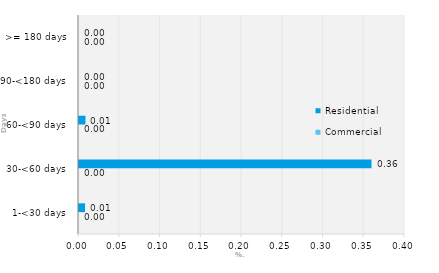
| Category | Commercial | Residential |
|---|---|---|
| 1-<30 days | 0 | 0.007 |
| 30-<60 days | 0 | 0.359 |
| 60-<90 days | 0 | 0.008 |
| 90-<180 days | 0 | 0 |
| >= 180 days | 0 | 0 |